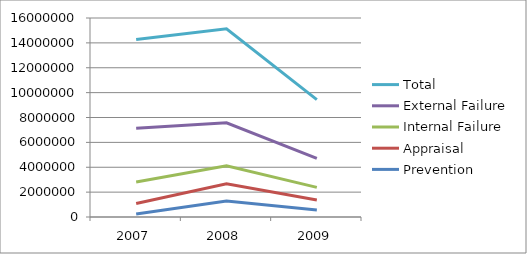
| Category | Prevention | Appraisal | Internal Failure | External Failure | Total |
|---|---|---|---|---|---|
| 2007.0 | 240000 | 840000 | 1740000 | 4320000 | 7140000 |
| 2008.0 | 1280000 | 1400000 | 1440000 | 3448000 | 7568000 |
| 2009.0 | 560000 | 800000 | 1020000 | 2336000 | 4716000 |